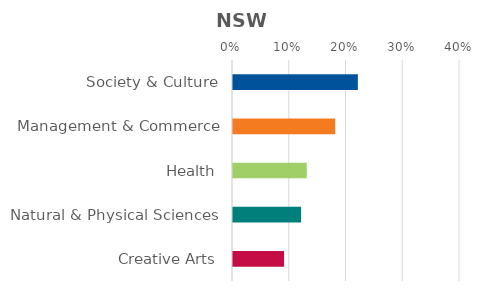
| Category | Series 0 |
|---|---|
| Society & Culture | 0.22 |
| Management & Commerce | 0.18 |
| Health | 0.13 |
| Natural & Physical Sciences | 0.12 |
| Creative Arts | 0.09 |